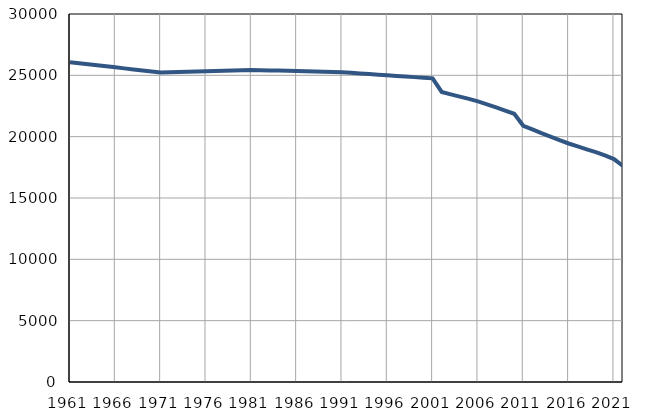
| Category | Број
становника |
|---|---|
| 1961.0 | 26074 |
| 1962.0 | 25990 |
| 1963.0 | 25905 |
| 1964.0 | 25821 |
| 1965.0 | 25737 |
| 1966.0 | 25653 |
| 1967.0 | 25568 |
| 1968.0 | 25484 |
| 1969.0 | 25400 |
| 1970.0 | 25315 |
| 1971.0 | 25231 |
| 1972.0 | 25252 |
| 1973.0 | 25273 |
| 1974.0 | 25294 |
| 1975.0 | 25315 |
| 1976.0 | 25336 |
| 1977.0 | 25357 |
| 1978.0 | 25378 |
| 1979.0 | 25399 |
| 1980.0 | 25420 |
| 1981.0 | 25441 |
| 1982.0 | 25422 |
| 1983.0 | 25404 |
| 1984.0 | 25385 |
| 1985.0 | 25367 |
| 1986.0 | 25347 |
| 1987.0 | 25329 |
| 1988.0 | 25311 |
| 1989.0 | 25293 |
| 1990.0 | 25274 |
| 1991.0 | 25255 |
| 1992.0 | 25205 |
| 1993.0 | 25155 |
| 1994.0 | 25104 |
| 1995.0 | 25054 |
| 1996.0 | 25004 |
| 1997.0 | 24954 |
| 1998.0 | 24904 |
| 1999.0 | 24854 |
| 2000.0 | 24803 |
| 2001.0 | 24753 |
| 2002.0 | 23647 |
| 2003.0 | 23453 |
| 2004.0 | 23265 |
| 2005.0 | 23079 |
| 2006.0 | 22872 |
| 2007.0 | 22639 |
| 2008.0 | 22380 |
| 2009.0 | 22117 |
| 2010.0 | 21868 |
| 2011.0 | 20889 |
| 2012.0 | 20587 |
| 2013.0 | 20281 |
| 2014.0 | 20012 |
| 2015.0 | 19718 |
| 2016.0 | 19443 |
| 2017.0 | 19201 |
| 2018.0 | 18967 |
| 2019.0 | 18738 |
| 2020.0 | 18472 |
| 2021.0 | 18174 |
| 2022.0 | 17615 |